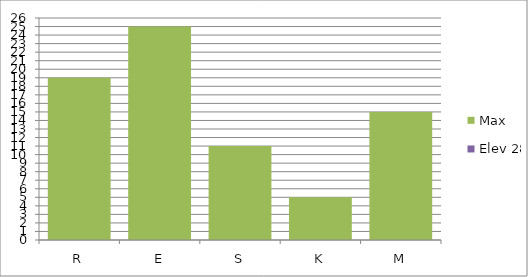
| Category | Max | Elev 28 |
|---|---|---|
| R | 19 | 0 |
| E | 25 | 0 |
| S | 11 | 0 |
| K | 5 | 0 |
| M | 15 | 0 |